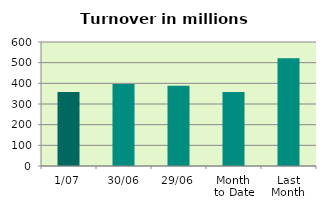
| Category | Series 0 |
|---|---|
| 1/07 | 357.77 |
| 30/06 | 396.979 |
| 29/06 | 387.794 |
| Month 
to Date | 357.77 |
| Last
Month | 521.023 |